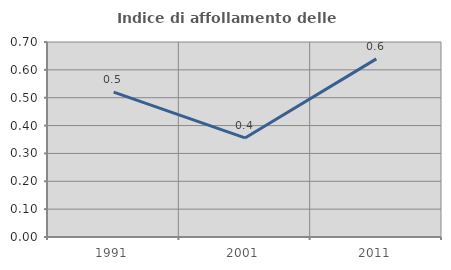
| Category | Indice di affollamento delle abitazioni  |
|---|---|
| 1991.0 | 0.52 |
| 2001.0 | 0.356 |
| 2011.0 | 0.639 |